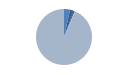
| Category | Series 0 |
|---|---|
| ARRASTRE | 92 |
| CERCO | 60 |
| PALANGRE | 15 |
| REDES DE ENMALLE | 6 |
| ARTES MENORES | 2472 |
| SIN TIPO ASIGNADO | 2 |